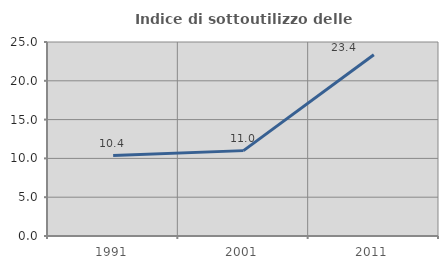
| Category | Indice di sottoutilizzo delle abitazioni  |
|---|---|
| 1991.0 | 10.366 |
| 2001.0 | 11.002 |
| 2011.0 | 23.361 |